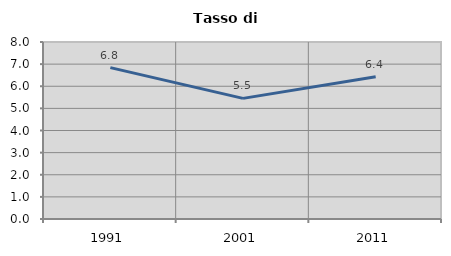
| Category | Tasso di disoccupazione   |
|---|---|
| 1991.0 | 6.841 |
| 2001.0 | 5.451 |
| 2011.0 | 6.428 |